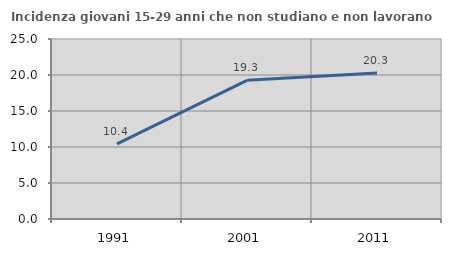
| Category | Incidenza giovani 15-29 anni che non studiano e non lavorano  |
|---|---|
| 1991.0 | 10.44 |
| 2001.0 | 19.255 |
| 2011.0 | 20.29 |